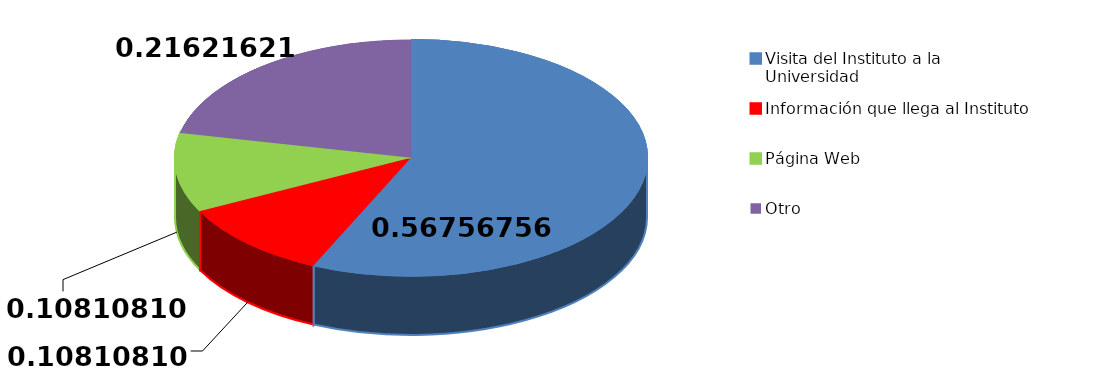
| Category | Frecuencia | Series 1 |
|---|---|---|
| Visita del Instituto a la Universidad | 21 |  |
| Información que llega al Instituto | 4 |  |
| Página Web | 4 |  |
| Otro | 8 |  |